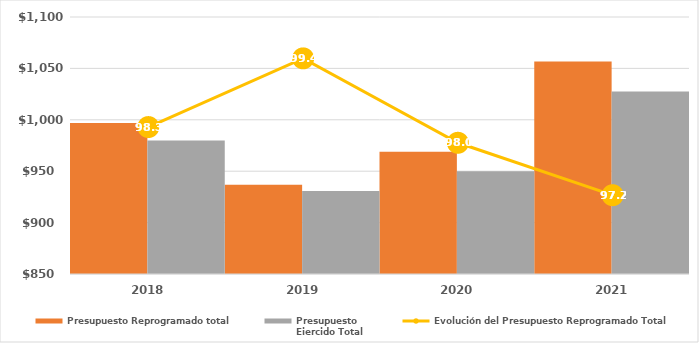
| Category | Presupuesto Reprogramado total | Presupuesto
Ejercido Total |
|---|---|---|
| 2018.0 | 996988 | 979910 |
| 2019.0 | 936775.686 | 930744.078 |
| 2020.0 | 968900.978 | 949931.095 |
| 2021.0 | 1056806.473 | 1027496.009 |